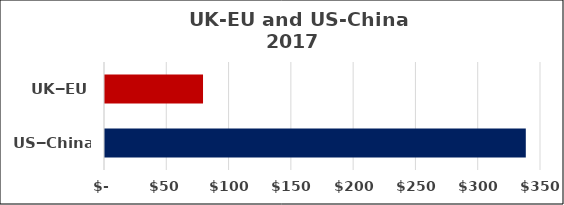
| Category | US$ bn |
|---|---|
| US‒China  | 337.8 |
| UK‒EU | 78.69 |